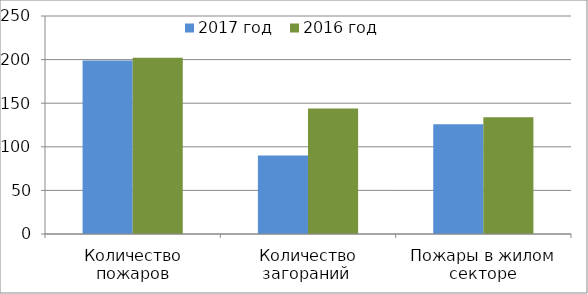
| Category | 2017 год | 2016 год |
|---|---|---|
| Количество пожаров | 199 | 202 |
| Количество загораний  | 90 | 144 |
| Пожары в жилом секторе | 126 | 134 |